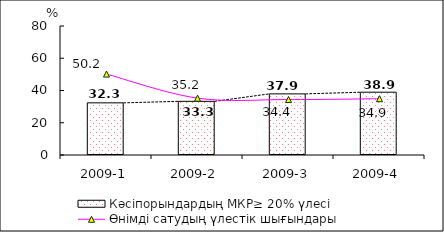
| Category | Кәсіпорындардың МКР≥ 20% үлесі |
|---|---|
| 2009-1 | 32.343 |
| 2009-2 | 33.28 |
| 2009-3 | 37.903 |
| 2009-4 | 38.944 |